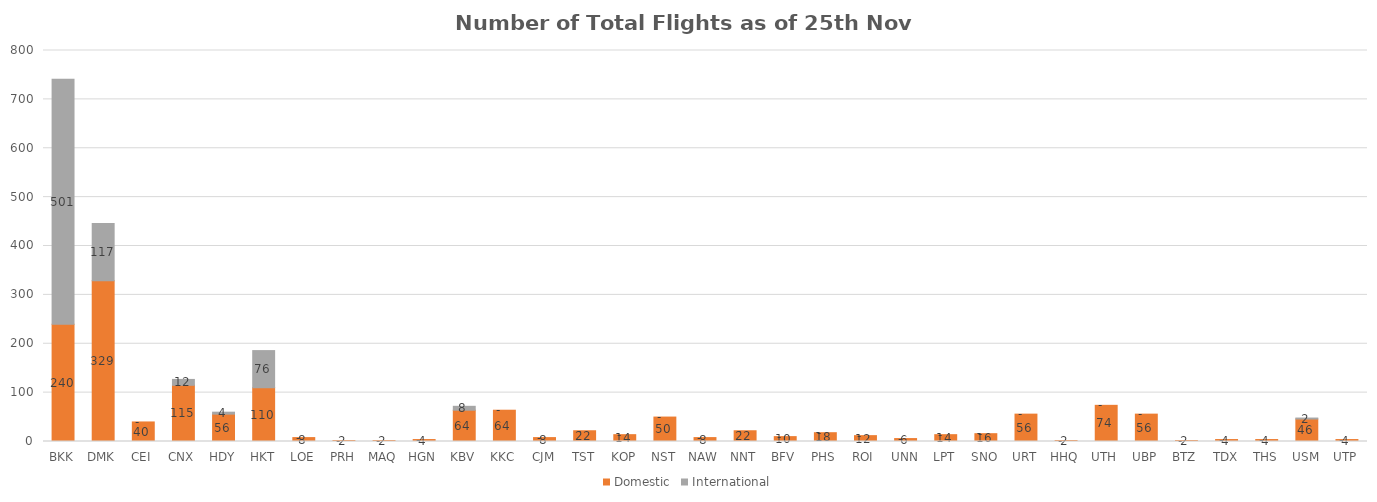
| Category | Domestic | International |
|---|---|---|
| BKK | 240 | 501 |
| DMK | 329 | 117 |
| CEI | 40 | 0 |
| CNX | 115 | 12 |
| HDY | 56 | 4 |
| HKT | 110 | 76 |
| LOE | 8 | 0 |
| PRH | 2 | 0 |
| MAQ | 2 | 0 |
| HGN | 4 | 0 |
| KBV | 64 | 8 |
| KKC | 64 | 0 |
| CJM | 8 | 0 |
| TST | 22 | 0 |
| KOP | 14 | 0 |
| NST | 50 | 0 |
| NAW | 8 | 0 |
| NNT | 22 | 0 |
| BFV | 10 | 0 |
| PHS | 18 | 0 |
| ROI | 12 | 0 |
| UNN | 6 | 0 |
| LPT | 14 | 0 |
| SNO | 16 | 0 |
| URT | 56 | 0 |
| HHQ | 2 | 0 |
| UTH | 74 | 0 |
| UBP | 56 | 0 |
| BTZ | 2 | 0 |
| TDX | 4 | 0 |
| THS | 4 | 0 |
| USM | 46 | 2 |
| UTP | 4 | 0 |